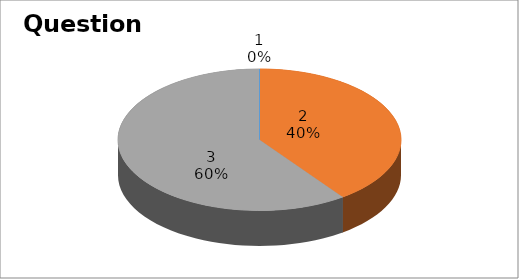
| Category | Series 0 |
|---|---|
| 0 | 0 |
| 1 | 4 |
| 2 | 6 |